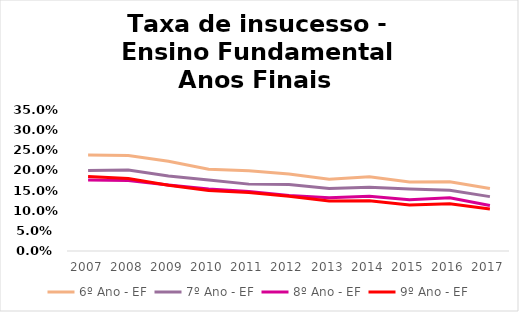
| Category | 6º Ano - EF | 7º Ano - EF | 8º Ano - EF | 9º Ano - EF |
|---|---|---|---|---|
| 2007.0 | 0.238 | 0.2 | 0.176 | 0.185 |
| 2008.0 | 0.237 | 0.201 | 0.175 | 0.18 |
| 2009.0 | 0.223 | 0.186 | 0.164 | 0.163 |
| 2010.0 | 0.203 | 0.176 | 0.154 | 0.15 |
| 2011.0 | 0.199 | 0.166 | 0.148 | 0.145 |
| 2012.0 | 0.191 | 0.165 | 0.138 | 0.136 |
| 2013.0 | 0.178 | 0.155 | 0.132 | 0.124 |
| 2014.0 | 0.184 | 0.158 | 0.136 | 0.125 |
| 2015.0 | 0.171 | 0.154 | 0.127 | 0.114 |
| 2016.0 | 0.172 | 0.151 | 0.132 | 0.117 |
| 2017.0 | 0.155 | 0.135 | 0.113 | 0.104 |